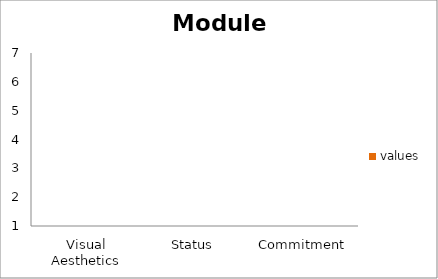
| Category | values |
|---|---|
| Visual Aesthetics | 0 |
| Status | 0 |
| Commitment | 0 |